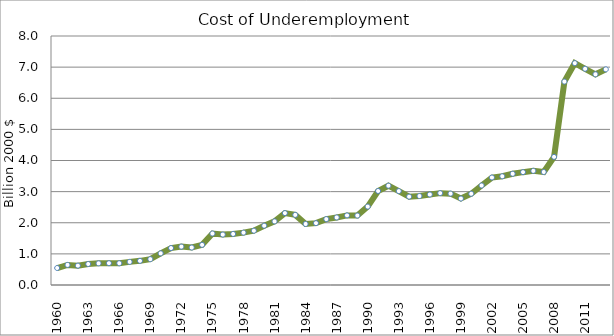
| Category | Series 0 |
|---|---|
| 1960.0 | 0.546 |
| 1961.0 | 0.646 |
| 1962.0 | 0.622 |
| 1963.0 | 0.674 |
| 1964.0 | 0.696 |
| 1965.0 | 0.7 |
| 1966.0 | 0.698 |
| 1967.0 | 0.743 |
| 1968.0 | 0.776 |
| 1969.0 | 0.83 |
| 1970.0 | 1.018 |
| 1971.0 | 1.187 |
| 1972.0 | 1.233 |
| 1973.0 | 1.204 |
| 1974.0 | 1.29 |
| 1975.0 | 1.654 |
| 1976.0 | 1.621 |
| 1977.0 | 1.641 |
| 1978.0 | 1.682 |
| 1979.0 | 1.744 |
| 1980.0 | 1.906 |
| 1981.0 | 2.044 |
| 1982.0 | 2.31 |
| 1983.0 | 2.253 |
| 1984.0 | 1.961 |
| 1985.0 | 1.987 |
| 1986.0 | 2.117 |
| 1987.0 | 2.17 |
| 1988.0 | 2.236 |
| 1989.0 | 2.232 |
| 1990.0 | 2.519 |
| 1991.0 | 3.021 |
| 1992.0 | 3.19 |
| 1993.0 | 3.017 |
| 1994.0 | 2.839 |
| 1995.0 | 2.858 |
| 1996.0 | 2.908 |
| 1997.0 | 2.951 |
| 1998.0 | 2.936 |
| 1999.0 | 2.778 |
| 2000.0 | 2.932 |
| 2001.0 | 3.197 |
| 2002.0 | 3.454 |
| 2003.0 | 3.493 |
| 2004.0 | 3.574 |
| 2005.0 | 3.626 |
| 2006.0 | 3.667 |
| 2007.0 | 3.631 |
| 2008.0 | 4.117 |
| 2009.0 | 6.535 |
| 2010.0 | 7.127 |
| 2011.0 | 6.947 |
| 2012.0 | 6.77 |
| 2013.0 | 6.928 |